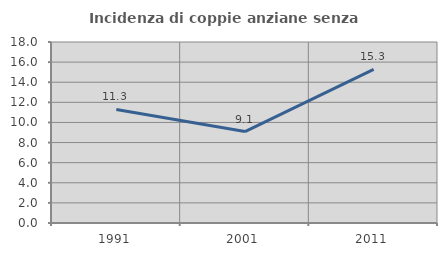
| Category | Incidenza di coppie anziane senza figli  |
|---|---|
| 1991.0 | 11.29 |
| 2001.0 | 9.091 |
| 2011.0 | 15.278 |